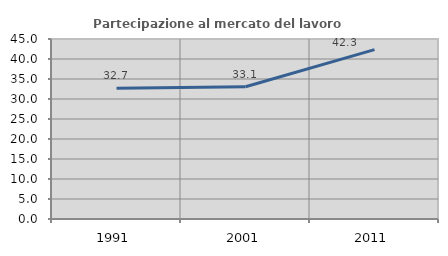
| Category | Partecipazione al mercato del lavoro  femminile |
|---|---|
| 1991.0 | 32.668 |
| 2001.0 | 33.056 |
| 2011.0 | 42.35 |